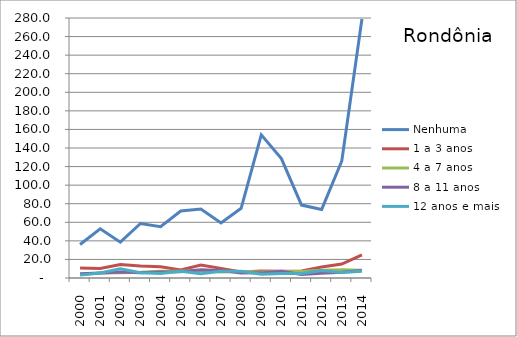
| Category | Nenhuma | 1 a 3 anos | 4 a 7 anos | 8 a 11 anos | 12 anos e mais |
|---|---|---|---|---|---|
| 2000.0 | 36.082 | 10.843 | 3.75 | 4.494 | 3.099 |
| 2001.0 | 53.021 | 10.265 | 5.358 | 5.41 | 5.333 |
| 2002.0 | 38.56 | 14.515 | 5.616 | 6.483 | 9.994 |
| 2003.0 | 58.719 | 12.858 | 6.12 | 5.694 | 5.736 |
| 2004.0 | 55.344 | 11.999 | 7.298 | 6.548 | 4.892 |
| 2005.0 | 72.115 | 8.713 | 7.273 | 6.643 | 7.321 |
| 2006.0 | 74.286 | 13.991 | 8.143 | 8.906 | 4.596 |
| 2007.0 | 59.233 | 10.381 | 6.577 | 8.122 | 7.213 |
| 2008.0 | 75.085 | 6.407 | 7.028 | 5.276 | 7.173 |
| 2009.0 | 154.185 | 7.411 | 6.531 | 5.523 | 4.077 |
| 2010.0 | 128.655 | 7.186 | 6.892 | 7.365 | 4.857 |
| 2011.0 | 78.534 | 7.446 | 7.128 | 3.849 | 4.874 |
| 2012.0 | 73.826 | 11.817 | 8.316 | 5.119 | 8.053 |
| 2013.0 | 126.05 | 15.013 | 8.968 | 6.139 | 5.957 |
| 2014.0 | 278.846 | 24.826 | 8.391 | 8.112 | 7.17 |